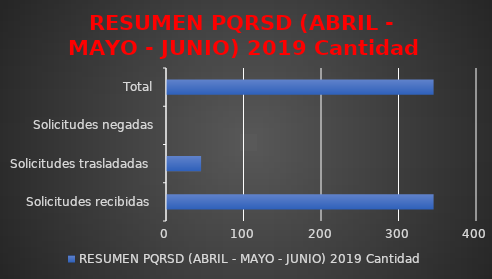
| Category | RESUMEN PQRSD (ABRIL - MAYO - JUNIO) 2019 |
|---|---|
| Solicitudes recibidas  | 344 |
| Solicitudes trasladadas  | 44 |
| Solicitudes negadas | 0 |
| Total | 344 |